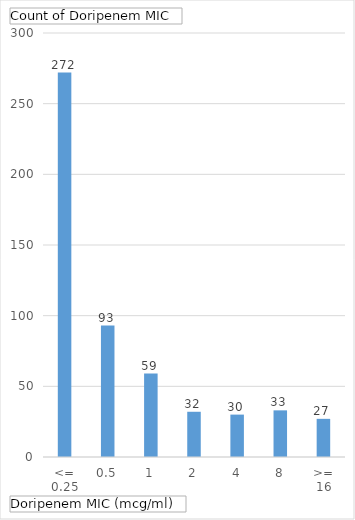
| Category | Total |
|---|---|
| <= 0.25 | 272 |
| 0.5 | 93 |
| 1 | 59 |
| 2 | 32 |
| 4 | 30 |
| 8 | 33 |
| >= 16 | 27 |